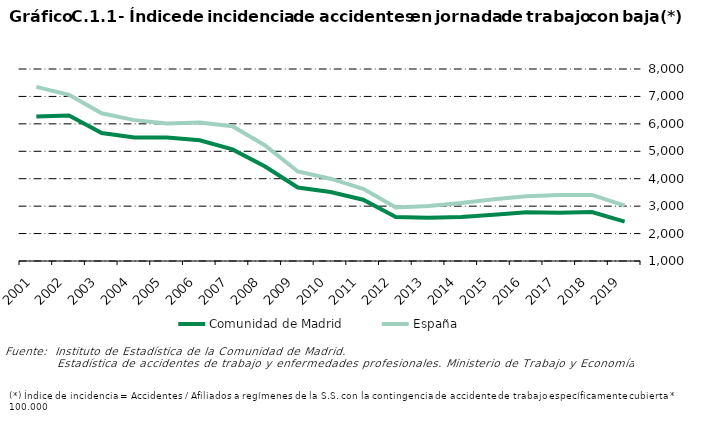
| Category | Comunidad de Madrid | España |
|---|---|---|
| 2001.0 | 6263.812 | 7349.906 |
| 2002.0 | 6301.191 | 7057.188 |
| 2003.0 | 5668.511 | 6386.686 |
| 2004.0 | 5499.328 | 6136.386 |
| 2005.0 | 5505.664 | 6011.816 |
| 2006.0 | 5403.6 | 6047.6 |
| 2007.0 | 5069.1 | 5914.3 |
| 2008.0 | 4446.967 | 5210.821 |
| 2009.0 | 3681.016 | 4263.424 |
| 2010.0 | 3513.805 | 4000.06 |
| 2011.0 | 3234.665 | 3633.764 |
| 2012.0 | 2604.886 | 2948.946 |
| 2013.0 | 2575.348 | 3009.214 |
| 2014.0 | 2602.73 | 3111.3 |
| 2015.0 | 2688.053 | 3252.005 |
| 2016.0 | 2778.158 | 3364.042 |
| 2017.0 | 2757.499 | 3408.761 |
| 2018.0 | 2784.151 | 3408.696 |
| 2019.0 | 2437.119 | 3019.64 |